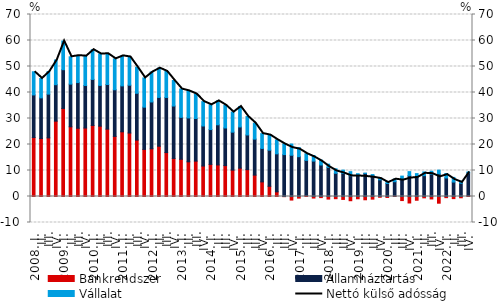
| Category | Bankrendszer | Államháztartás | Vállalat |
|---|---|---|---|
| 2008. I. | 22.687 | 16.383 | 8.905 |
|          II. | 22.302 | 15.632 | 7.464 |
|          III. | 22.546 | 16.826 | 8.669 |
|          IV. | 28.975 | 14.03 | 9.491 |
| 2009. I. | 33.864 | 14.909 | 11.025 |
|          II. | 26.811 | 16.412 | 10.515 |
|          III. | 26.251 | 17.578 | 10.348 |
|          IV. | 26.341 | 16.359 | 11.274 |
| 2010. I. | 27.323 | 17.709 | 11.434 |
|          II. | 27.05 | 15.677 | 12.099 |
|          III. | 25.913 | 17.174 | 11.79 |
|          IV. | 23.117 | 17.938 | 11.88 |
| 2011. I. | 24.887 | 17.66 | 11.548 |
|          II. | 24.412 | 18.395 | 10.845 |
|          III. | 21.689 | 18.018 | 10.013 |
|          IV. | 18.104 | 16.258 | 11.245 |
| 2012. I. | 18.362 | 18.001 | 11.53 |
|          II. | 19.341 | 18.758 | 11.252 |
|          III. | 16.894 | 21.196 | 10.013 |
|          IV. | 14.629 | 20.171 | 9.826 |
| 2013. I. | 14.328 | 16.11 | 10.887 |
| II. | 13.34 | 16.882 | 10.367 |
|          III. | 13.602 | 16.389 | 9.401 |
| IV. | 11.723 | 15.4 | 9.37 |
| 2014. I. | 12.351 | 13.401 | 9.502 |
| II. | 12.137 | 15.448 | 9.187 |
| III. | 11.891 | 14.465 | 8.697 |
| IV. | 10.149 | 14.601 | 7.703 |
| 2015. I. | 10.906 | 15.845 | 7.86 |
| II. | 10.329 | 13.34 | 7.084 |
| III. | 8.225 | 13.85 | 6.106 |
| IV. | 5.629 | 12.857 | 5.704 |
| 2016. I. | 3.932 | 13.888 | 5.793 |
| II. | 1.8 | 14.612 | 5.376 |
| III. | -0.068 | 16.116 | 4.089 |
| IV. | -1.368 | 15.868 | 4.316 |
| 2017. I. | -0.624 | 15.314 | 3.491 |
| II. | 0.346 | 13.558 | 2.536 |
| III. | -0.599 | 13.622 | 2.153 |
| IV. | -0.426 | 12.115 | 1.875 |
| 2018. I. | -0.991 | 11.193 | 1.242 |
| II. | -0.842 | 8.939 | 1.709 |
| III. | -1.124 | 8.903 | 1.228 |
| IV. | -1.622 | 8.007 | 1.552 |
| 2019. I. | -0.872 | 8.236 | 0.533 |
| II. | -1.257 | 8.898 | 0.063 |
| III. | -1.015 | 8.143 | 0.281 |
| IV. | -0.294 | 6.406 | 0.781 |
| 2020. I. | -0.371 | 5.011 | 0.719 |
| II. | 0.137 | 5.551 | 0.982 |
| III. | -1.564 | 6.607 | 1.234 |
| IV. | -2.495 | 8.008 | 1.557 |
| 2021. I. | -1.442 | 7.485 | 1.323 |
| II. | -0.52 | 8.016 | 1.433 |
|          III. | -0.942 | 8.627 | 1.091 |
| IV. | -2.575 | 8.685 | 1.449 |
| 2022. I. | -0.447 | 7.135 | 1.722 |
| II. | -0.815 | 5.559 | 1.785 |
|          III. | -0.491 | 5.108 | 0.799 |
| IV. | 0.247 | 8.876 | 0.325 |